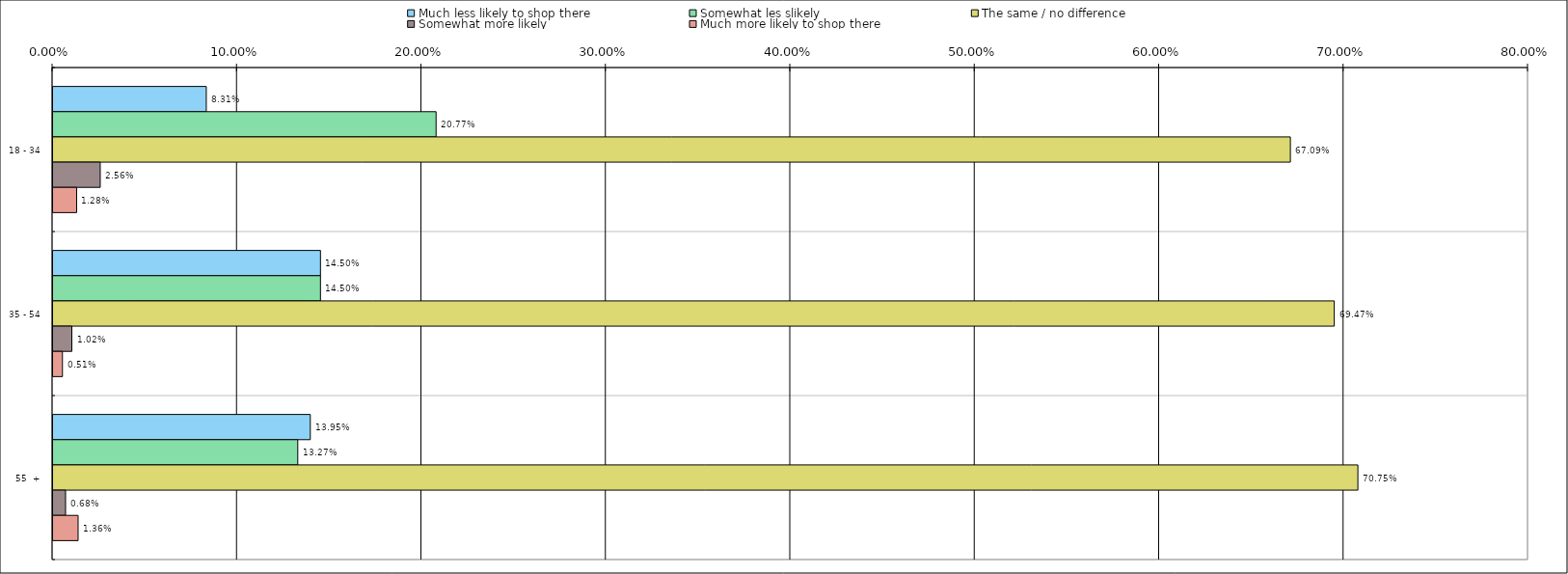
| Category | Much less likely to shop there | Somewhat les slikely | The same / no difference | Somewhat more likely | Much more likely to shop there |
|---|---|---|---|---|---|
| 0 | 0.083 | 0.208 | 0.671 | 0.026 | 0.013 |
| 1 | 0.145 | 0.145 | 0.695 | 0.01 | 0.005 |
| 2 | 0.14 | 0.133 | 0.708 | 0.007 | 0.014 |